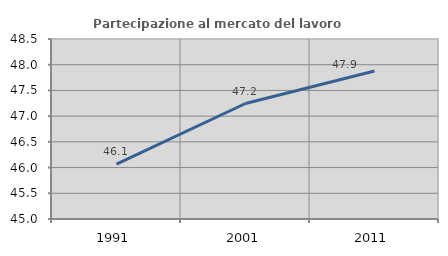
| Category | Partecipazione al mercato del lavoro  femminile |
|---|---|
| 1991.0 | 46.068 |
| 2001.0 | 47.246 |
| 2011.0 | 47.876 |